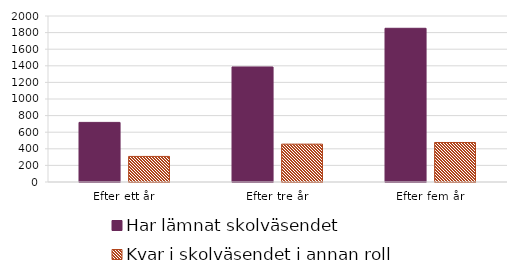
| Category | Har lämnat skolväsendet | Kvar i skolväsendet i annan roll |
|---|---|---|
| Efter ett år | 718 | 308 |
| Efter tre år | 1386 | 456 |
| Efter fem år | 1852 | 476 |